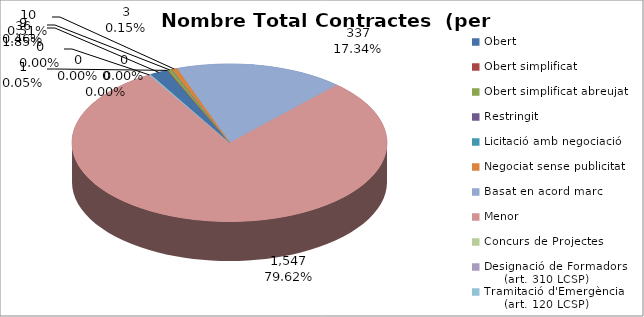
| Category | Nombre Total Contractes |
|---|---|
| Obert | 36 |
| Obert simplificat | 1 |
| Obert simplificat abreujat | 9 |
| Restringit | 0 |
| Licitació amb negociació | 0 |
| Negociat sense publicitat | 10 |
| Basat en acord marc | 337 |
| Menor | 1547 |
| Concurs de Projectes | 0 |
| Designació de Formadors
     (art. 310 LCSP) | 0 |
| Tramitació d'Emergència
     (art. 120 LCSP) | 3 |